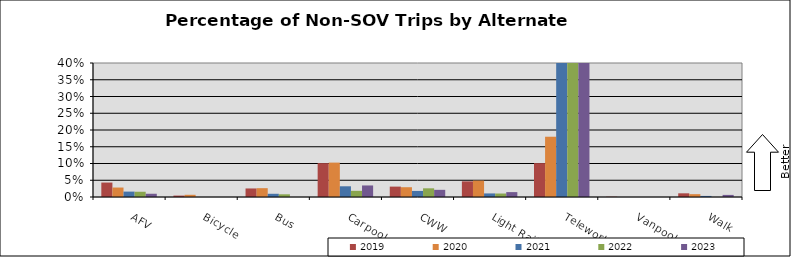
| Category | 2019 | 2020 | 2021 | 2022 | 2023 |
|---|---|---|---|---|---|
| AFV | 0.043 | 0.028 | 0.016 | 0.016 | 0.01 |
| Bicycle | 0.004 | 0.007 | 0 | 0 | 0 |
| Bus | 0.026 | 0.026 | 0.01 | 0.008 | 0 |
| Carpool | 0.101 | 0.103 | 0.032 | 0.018 | 0.034 |
| CWW | 0.031 | 0.029 | 0.018 | 0.026 | 0.021 |
| Light Rail | 0.047 | 0.049 | 0.011 | 0.01 | 0.015 |
| Telework | 0.101 | 0.18 | 0.761 | 0.689 | 0.697 |
| Vanpool | 0.001 | 0 | 0 | 0 | 0 |
| Walk | 0.011 | 0.008 | 0.003 | 0 | 0.006 |